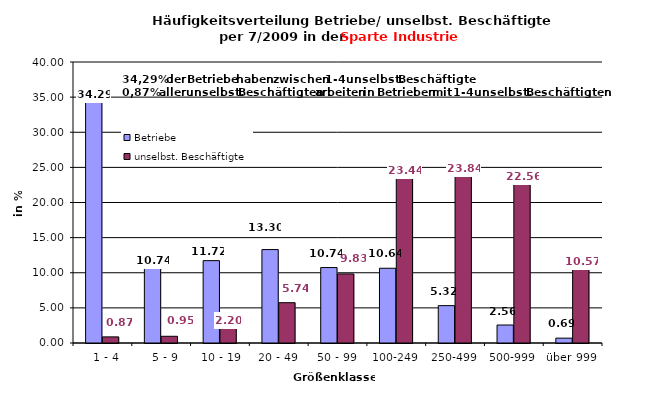
| Category | Betriebe | unselbst. Beschäftigte |
|---|---|---|
|   1 - 4 | 34.286 | 0.87 |
|   5 - 9 | 10.739 | 0.955 |
|  10 - 19 | 11.724 | 2.198 |
| 20 - 49 | 13.3 | 5.738 |
| 50 - 99 | 10.739 | 9.835 |
| 100-249 | 10.64 | 23.437 |
| 250-499 | 5.32 | 23.835 |
| 500-999 | 2.562 | 22.563 |
| über 999 | 0.69 | 10.569 |